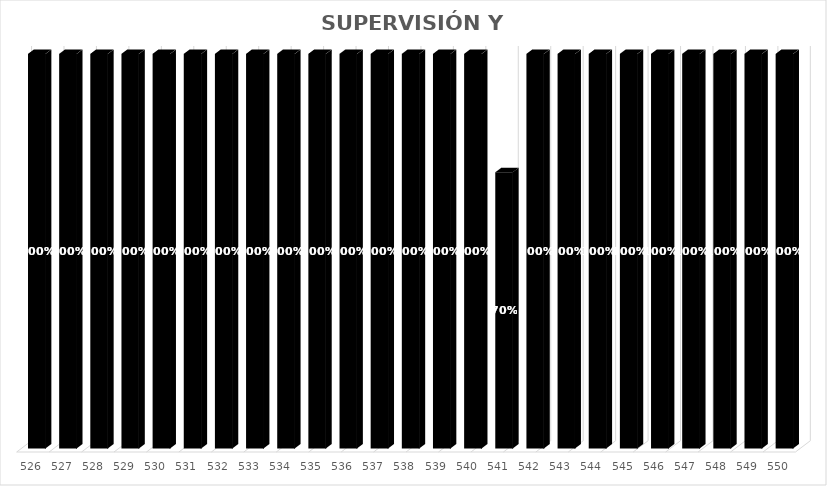
| Category | % Avance |
|---|---|
| 526.0 | 1 |
| 527.0 | 1 |
| 528.0 | 1 |
| 529.0 | 1 |
| 530.0 | 1 |
| 531.0 | 1 |
| 532.0 | 1 |
| 533.0 | 1 |
| 534.0 | 1 |
| 535.0 | 1 |
| 536.0 | 1 |
| 537.0 | 1 |
| 538.0 | 1 |
| 539.0 | 1 |
| 540.0 | 1 |
| 541.0 | 0.7 |
| 542.0 | 1 |
| 543.0 | 1 |
| 544.0 | 1 |
| 545.0 | 1 |
| 546.0 | 1 |
| 547.0 | 1 |
| 548.0 | 1 |
| 549.0 | 1 |
| 550.0 | 1 |